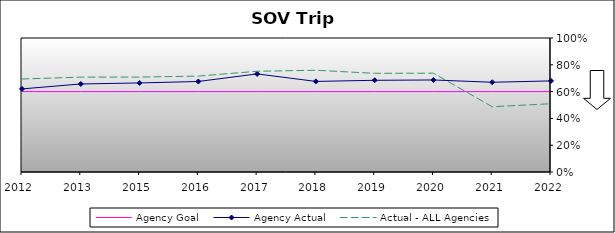
| Category | Agency Goal | Agency Actual | Actual - ALL Agencies |
|---|---|---|---|
| 2012.0 | 0.6 | 0.62 | 0.694 |
| 2013.0 | 0.6 | 0.657 | 0.708 |
| 2015.0 | 0.6 | 0.665 | 0.708 |
| 2016.0 | 0.6 | 0.676 | 0.716 |
| 2017.0 | 0.6 | 0.732 | 0.752 |
| 2018.0 | 0.6 | 0.676 | 0.759 |
| 2019.0 | 0.6 | 0.684 | 0.736 |
| 2020.0 | 0.6 | 0.687 | 0.737 |
| 2021.0 | 0.6 | 0.67 | 0.487 |
| 2022.0 | 0.6 | 0.68 | 0.509 |